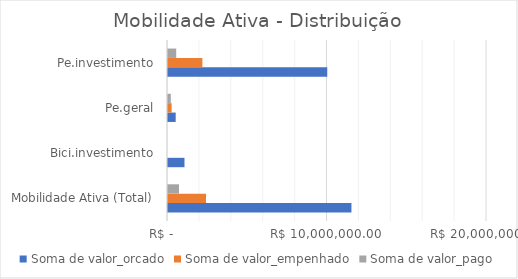
| Category | Soma de valor_orcado | Soma de valor_empenhado | Soma de valor_pago |
|---|---|---|---|
| Mobilidade Ativa (Total) | 11500689 | 2382764.02 | 690236.97 |
| Bici.investimento | 1034000 | 0 | 0 |
| Pe.geral | 481770 | 226916.74 | 175485.34 |
| Pe.investimento | 9984919 | 2155847.28 | 514751.63 |